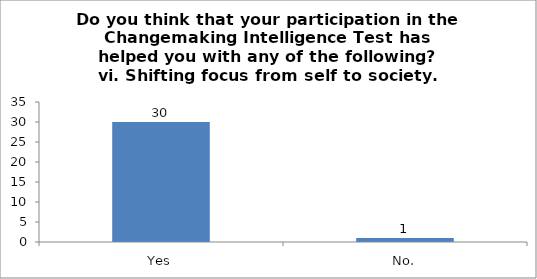
| Category | Do you think that your participation in the Changemaking Intelligence Test has helped you with any of the following?
vi. Shifting focus from self to society. |
|---|---|
| Yes | 30 |
| No. | 1 |